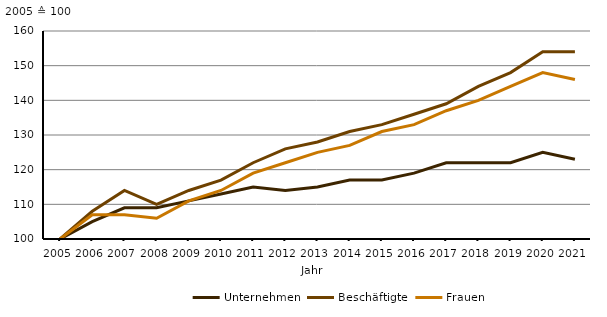
| Category | Unternehmen | Beschäftigte | Frauen |
|---|---|---|---|
| 2005.0 | 100 | 100 | 100 |
| 2006.0 | 105 | 108 | 107 |
| 2007.0 | 109 | 114 | 107 |
| 2008.0 | 109 | 110 | 106 |
| 2009.0 | 111 | 114 | 111 |
| 2010.0 | 113 | 117 | 114 |
| 2011.0 | 115 | 122 | 119 |
| 2012.0 | 114 | 126 | 122 |
| 2013.0 | 115 | 128 | 125 |
| 2014.0 | 117 | 131 | 127 |
| 2015.0 | 117 | 133 | 131 |
| 2016.0 | 119 | 136 | 133 |
| 2017.0 | 122 | 139 | 137 |
| 2018.0 | 122 | 144 | 140 |
| 2019.0 | 122 | 148 | 144 |
| 2020.0 | 125 | 154 | 148 |
| 2021.0 | 123 | 154 | 146 |